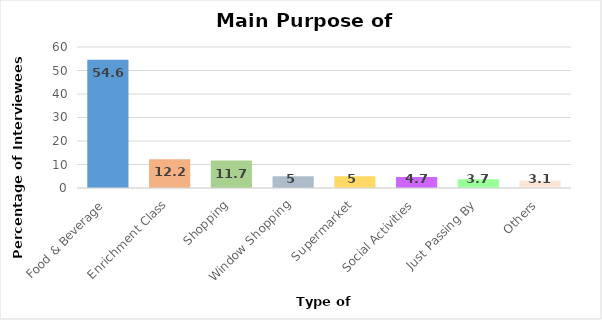
| Category | Series 0 |
|---|---|
| Food & Beverage | 54.6 |
| Enrichment Class | 12.2 |
| Shopping | 11.7 |
| Window Shopping | 5 |
| Supermarket | 5 |
| Social Activities | 4.7 |
| Just Passing By | 3.7 |
| Others | 3.1 |